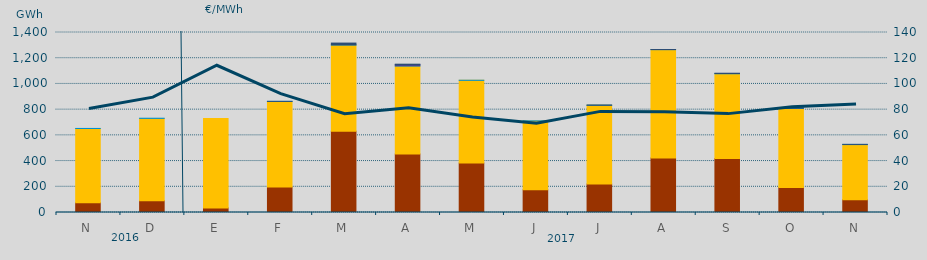
| Category | Carbón | Ciclo Combinado | Hidráulica | Nuclear | Consumo Bombeo |
|---|---|---|---|---|---|
| N | 76065.2 | 577468 | 240 | 0 | 0 |
| D | 91091.6 | 640964.5 | 1160 | 0 | 0 |
| E | 35729 | 696156.2 | 0 | 0 | 0 |
| F | 198516.2 | 665095.2 | 712.6 | 0 | 139.6 |
| M | 631868 | 670791.6 | 1411.7 | 0 | 13667.9 |
| A | 454829.4 | 684899.6 | 1412 | 9600 | 2812.1 |
| M | 384999.4 | 642959.4 | 538 | 0 | 0 |
| J | 176734.4 | 535700.2 | 240 | 0 | 0 |
| J | 221645.5 | 612390.3 | 245 | 0 | 1709.9 |
| A | 424631 | 842008.2 | 714.3 | 0 | 227.4 |
| S | 419522.2 | 659557.1 | 1903.2 | 0 | 2247.5 |
| O | 195163.5 | 613794.4 | 1865.1 | 0 | 2877.8 |
| N | 99779.8 | 428275.6 | 1458.4 | 0 | 370 |